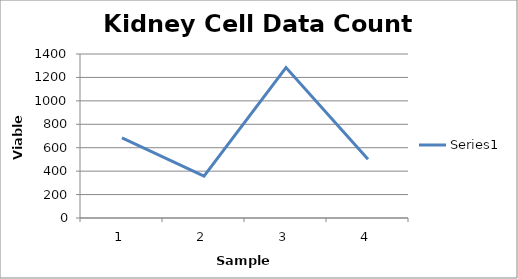
| Category | Series 0 |
|---|---|
| 0 | 684 |
| 1 | 358 |
| 2 | 1284 |
| 3 | 502 |